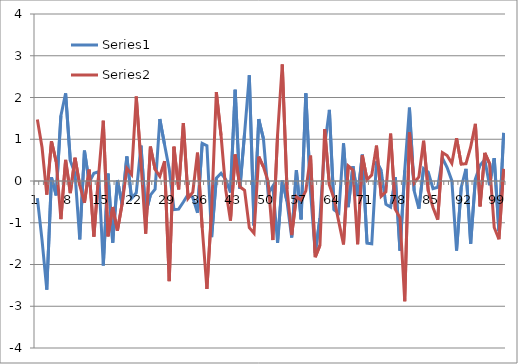
| Category | Series 0 | Series 1 |
|---|---|---|
| 0 | -0.41 | 1.475 |
| 1 | -1.423 | 0.802 |
| 2 | -2.602 | -0.328 |
| 3 | 0.087 | 0.953 |
| 4 | -0.344 | 0.46 |
| 5 | 1.564 | -0.916 |
| 6 | 2.1 | 0.505 |
| 7 | 0.487 | -0.291 |
| 8 | 0.178 | 0.557 |
| 9 | -1.398 | -0.101 |
| 10 | 0.728 | -0.523 |
| 11 | -0.033 | 0.273 |
| 12 | 0.186 | -1.33 |
| 13 | 0.221 | 0.123 |
| 14 | -2.024 | 1.444 |
| 15 | 0.178 | -1.326 |
| 16 | -1.475 | -0.622 |
| 17 | 0.023 | -1.189 |
| 18 | -0.559 | -0.544 |
| 19 | 0.587 | 0.303 |
| 20 | -0.418 | 0.158 |
| 21 | -0.282 | 2.024 |
| 22 | 0.845 | 0.441 |
| 23 | -0.778 | -1.26 |
| 24 | -0.339 | 0.823 |
| 25 | -0.194 | 0.278 |
| 26 | 1.484 | 0.111 |
| 27 | 0.875 | 0.474 |
| 28 | 0.288 | -2.398 |
| 29 | -0.683 | 0.822 |
| 30 | -0.674 | -0.2 |
| 31 | -0.502 | 1.389 |
| 32 | -0.319 | -0.414 |
| 33 | -0.395 | -0.265 |
| 34 | -0.759 | 0.678 |
| 35 | 0.901 | -1.119 |
| 36 | 0.844 | -2.586 |
| 37 | -1.342 | -0.687 |
| 38 | 0.068 | 2.127 |
| 39 | 0.185 | 1.089 |
| 40 | 0.037 | -0.214 |
| 41 | -0.276 | -0.949 |
| 42 | 2.186 | 0.635 |
| 43 | -0.185 | -0.139 |
| 44 | 1.145 | -0.222 |
| 45 | 2.532 | -1.117 |
| 46 | -1.067 | -1.252 |
| 47 | 1.482 | 0.583 |
| 48 | 1.011 | 0.339 |
| 49 | -0.3 | -0.015 |
| 50 | -0.123 | -1.414 |
| 51 | -1.48 | 1.108 |
| 52 | 0.012 | 2.791 |
| 53 | -0.485 | -0.192 |
| 54 | -1.353 | -1.294 |
| 55 | 0.262 | -0.372 |
| 56 | -0.92 | -0.459 |
| 57 | 2.099 | -0.236 |
| 58 | -0.261 | 0.608 |
| 59 | -1.724 | -1.825 |
| 60 | -0.893 | -1.539 |
| 61 | 0.847 | 1.24 |
| 62 | 1.703 | -0.097 |
| 63 | -0.691 | -0.427 |
| 64 | -0.768 | -0.979 |
| 65 | 0.901 | -1.52 |
| 66 | -0.627 | 0.36 |
| 67 | 0.352 | 0.262 |
| 68 | -0.362 | -1.515 |
| 69 | 0.632 | 0.622 |
| 70 | -1.49 | 0.028 |
| 71 | -1.505 | 0.147 |
| 72 | 0.473 | 0.848 |
| 73 | 0.248 | -0.365 |
| 74 | -0.557 | -0.26 |
| 75 | -0.625 | 1.136 |
| 76 | 0.09 | -0.679 |
| 77 | -1.666 | -0.882 |
| 78 | 0.256 | -2.881 |
| 79 | 1.756 | 1.168 |
| 80 | -0.234 | -0.049 |
| 81 | -0.662 | 0.098 |
| 82 | 0.298 | 0.964 |
| 83 | 0.21 | -0.24 |
| 84 | -0.182 | -0.633 |
| 85 | -0.15 | -0.926 |
| 86 | 0.548 | 0.682 |
| 87 | 0.323 | 0.611 |
| 88 | 0.008 | 0.424 |
| 89 | -1.665 | 1.026 |
| 90 | -0.149 | 0.402 |
| 91 | 0.289 | 0.414 |
| 92 | -1.5 | 0.817 |
| 93 | 0.048 | 1.37 |
| 94 | 0.378 | -0.61 |
| 95 | 0.512 | 0.671 |
| 96 | -0.101 | 0.42 |
| 97 | 0.546 | -1.113 |
| 98 | -1.2 | -1.396 |
| 99 | 1.153 | 0.291 |